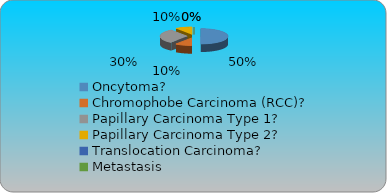
| Category | Series 0 | Series 1 | Series 2 | Series 3 |
|---|---|---|---|---|
| Oncytoma? | 0.5 |  |  |  |
| Chromophobe Carcinoma (RCC)? | 0.1 |  |  |  |
| Papillary Carcinoma Type 1?  | 0.3 |  |  |  |
| Papillary Carcinoma Type 2? | 0.1 |  |  |  |
| Translocation Carcinoma? | 0 |  |  |  |
| Metastasis | 0 |  |  |  |